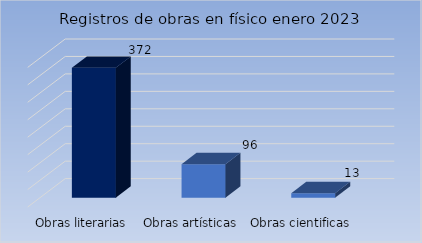
| Category | Cantidad |
|---|---|
| Obras literarias | 372 |
| Obras artísticas | 96 |
| Obras cientificas | 13 |